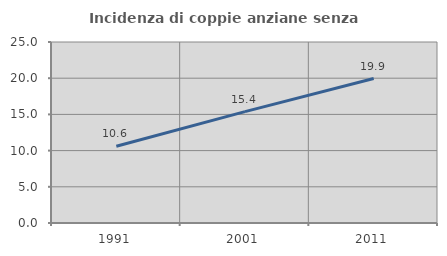
| Category | Incidenza di coppie anziane senza figli  |
|---|---|
| 1991.0 | 10.598 |
| 2001.0 | 15.385 |
| 2011.0 | 19.949 |